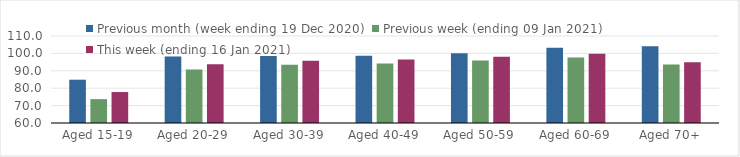
| Category | Previous month (week ending 19 Dec 2020) | Previous week (ending 09 Jan 2021) | This week (ending 16 Jan 2021) |
|---|---|---|---|
| Aged 15-19 | 84.88 | 73.71 | 77.8 |
| Aged 20-29 | 98.16 | 90.73 | 93.8 |
| Aged 30-39 | 98.52 | 93.54 | 95.84 |
| Aged 40-49 | 98.65 | 94.23 | 96.43 |
| Aged 50-59 | 100.03 | 95.89 | 98.1 |
| Aged 60-69 | 103.2 | 97.66 | 99.77 |
| Aged 70+ | 104.17 | 93.59 | 94.89 |